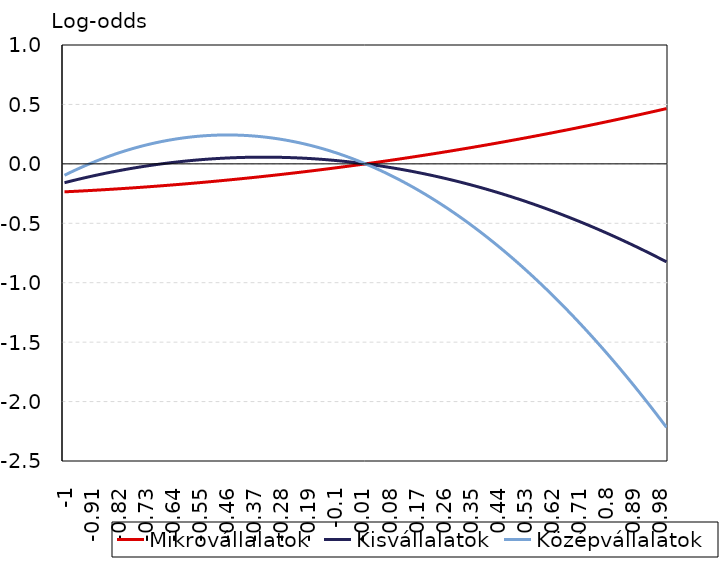
| Category | Mikrovállalatok | Kisvállalatok | Középvállalatok |
|---|---|---|---|
| -1.0 | -0.235 | -0.159 | -0.096 |
| -0.99 | -0.234 | -0.152 | -0.084 |
| -0.98 | -0.233 | -0.146 | -0.071 |
| -0.97 | -0.232 | -0.14 | -0.059 |
| -0.96 | -0.23 | -0.133 | -0.048 |
| -0.95 | -0.229 | -0.127 | -0.036 |
| -0.94 | -0.228 | -0.121 | -0.025 |
| -0.93 | -0.226 | -0.116 | -0.014 |
| -0.92 | -0.225 | -0.11 | -0.003 |
| -0.91 | -0.224 | -0.104 | 0.007 |
| -0.9 | -0.222 | -0.099 | 0.018 |
| -0.89 | -0.221 | -0.093 | 0.028 |
| -0.88 | -0.219 | -0.088 | 0.038 |
| -0.87 | -0.218 | -0.082 | 0.047 |
| -0.86 | -0.216 | -0.077 | 0.057 |
| -0.85 | -0.215 | -0.072 | 0.066 |
| -0.84 | -0.213 | -0.067 | 0.075 |
| -0.83 | -0.212 | -0.062 | 0.084 |
| -0.82 | -0.21 | -0.058 | 0.092 |
| -0.81 | -0.208 | -0.053 | 0.1 |
| -0.8 | -0.207 | -0.048 | 0.108 |
| -0.79 | -0.205 | -0.044 | 0.116 |
| -0.78 | -0.203 | -0.039 | 0.124 |
| -0.77 | -0.202 | -0.035 | 0.131 |
| -0.76 | -0.2 | -0.031 | 0.138 |
| -0.75 | -0.198 | -0.027 | 0.145 |
| -0.74 | -0.196 | -0.023 | 0.152 |
| -0.73 | -0.194 | -0.019 | 0.158 |
| -0.72 | -0.193 | -0.015 | 0.164 |
| -0.71 | -0.191 | -0.011 | 0.17 |
| -0.7 | -0.189 | -0.008 | 0.176 |
| -0.69 | -0.187 | -0.004 | 0.181 |
| -0.68 | -0.185 | -0.001 | 0.186 |
| -0.67 | -0.183 | 0.002 | 0.191 |
| -0.66 | -0.181 | 0.006 | 0.196 |
| -0.65 | -0.179 | 0.009 | 0.201 |
| -0.64 | -0.177 | 0.012 | 0.205 |
| -0.63 | -0.175 | 0.015 | 0.209 |
| -0.62 | -0.173 | 0.017 | 0.213 |
| -0.61 | -0.171 | 0.02 | 0.217 |
| -0.6 | -0.169 | 0.023 | 0.22 |
| -0.59 | -0.167 | 0.025 | 0.223 |
| -0.58 | -0.164 | 0.028 | 0.226 |
| -0.57 | -0.162 | 0.03 | 0.229 |
| -0.56 | -0.16 | 0.032 | 0.231 |
| -0.55 | -0.158 | 0.034 | 0.233 |
| -0.54 | -0.156 | 0.036 | 0.235 |
| -0.53 | -0.153 | 0.038 | 0.237 |
| -0.52 | -0.151 | 0.04 | 0.239 |
| -0.51 | -0.149 | 0.042 | 0.24 |
| -0.5 | -0.146 | 0.044 | 0.241 |
| -0.49 | -0.144 | 0.045 | 0.242 |
| -0.48 | -0.142 | 0.047 | 0.243 |
| -0.47 | -0.139 | 0.048 | 0.243 |
| -0.46 | -0.137 | 0.049 | 0.243 |
| -0.45 | -0.134 | 0.05 | 0.243 |
| -0.44 | -0.132 | 0.051 | 0.243 |
| -0.429999999999999 | -0.129 | 0.052 | 0.242 |
| -0.419999999999999 | -0.127 | 0.053 | 0.241 |
| -0.409999999999999 | -0.124 | 0.054 | 0.24 |
| -0.399999999999999 | -0.122 | 0.055 | 0.239 |
| -0.389999999999999 | -0.119 | 0.055 | 0.238 |
| -0.379999999999999 | -0.116 | 0.056 | 0.236 |
| -0.369999999999999 | -0.114 | 0.056 | 0.234 |
| -0.359999999999999 | -0.111 | 0.056 | 0.232 |
| -0.349999999999999 | -0.108 | 0.056 | 0.23 |
| -0.339999999999999 | -0.106 | 0.056 | 0.227 |
| -0.329999999999999 | -0.103 | 0.056 | 0.224 |
| -0.319999999999999 | -0.1 | 0.056 | 0.221 |
| -0.309999999999999 | -0.098 | 0.056 | 0.218 |
| -0.299999999999999 | -0.095 | 0.056 | 0.214 |
| -0.289999999999999 | -0.092 | 0.055 | 0.21 |
| -0.279999999999999 | -0.089 | 0.055 | 0.206 |
| -0.269999999999999 | -0.086 | 0.054 | 0.202 |
| -0.259999999999999 | -0.083 | 0.053 | 0.198 |
| -0.249999999999999 | -0.08 | 0.053 | 0.193 |
| -0.239999999999999 | -0.077 | 0.052 | 0.188 |
| -0.229999999999999 | -0.074 | 0.051 | 0.183 |
| -0.219999999999999 | -0.071 | 0.049 | 0.177 |
| -0.209999999999999 | -0.068 | 0.048 | 0.172 |
| -0.199999999999999 | -0.065 | 0.047 | 0.166 |
| -0.189999999999999 | -0.062 | 0.046 | 0.16 |
| -0.179999999999999 | -0.059 | 0.044 | 0.153 |
| -0.169999999999999 | -0.056 | 0.042 | 0.147 |
| -0.159999999999999 | -0.053 | 0.041 | 0.14 |
| -0.149999999999999 | -0.05 | 0.039 | 0.133 |
| -0.139999999999999 | -0.047 | 0.037 | 0.126 |
| -0.129999999999999 | -0.044 | 0.035 | 0.118 |
| -0.119999999999999 | -0.04 | 0.033 | 0.111 |
| -0.109999999999999 | -0.037 | 0.031 | 0.103 |
| -0.099999999999999 | -0.034 | 0.028 | 0.094 |
| -0.089999999999999 | -0.031 | 0.026 | 0.086 |
| -0.079999999999999 | -0.027 | 0.023 | 0.077 |
| -0.069999999999999 | -0.024 | 0.021 | 0.069 |
| -0.0599999999999991 | -0.021 | 0.018 | 0.059 |
| -0.049999999999999 | -0.017 | 0.015 | 0.05 |
| -0.039999999999999 | -0.014 | 0.013 | 0.041 |
| -0.029999999999999 | -0.01 | 0.01 | 0.031 |
| -0.019999999999999 | -0.007 | 0.006 | 0.021 |
| -0.00999999999999901 | -0.003 | 0.003 | 0.01 |
| 0.0 | 0 | 0 | 0 |
| 0.01 | 0.004 | -0.003 | -0.011 |
| 0.02 | 0.007 | -0.007 | -0.022 |
| 0.03 | 0.011 | -0.01 | -0.033 |
| 0.04 | 0.014 | -0.014 | -0.044 |
| 0.05 | 0.018 | -0.018 | -0.056 |
| 0.0600000000000001 | 0.021 | -0.022 | -0.068 |
| 0.0700000000000001 | 0.025 | -0.026 | -0.08 |
| 0.0800000000000001 | 0.029 | -0.03 | -0.092 |
| 0.0900000000000001 | 0.032 | -0.034 | -0.105 |
| 0.1 | 0.036 | -0.038 | -0.118 |
| 0.11 | 0.04 | -0.043 | -0.131 |
| 0.12 | 0.044 | -0.047 | -0.144 |
| 0.13 | 0.047 | -0.052 | -0.157 |
| 0.14 | 0.051 | -0.056 | -0.171 |
| 0.15 | 0.055 | -0.061 | -0.185 |
| 0.16 | 0.059 | -0.066 | -0.199 |
| 0.17 | 0.063 | -0.071 | -0.214 |
| 0.18 | 0.067 | -0.076 | -0.228 |
| 0.19 | 0.071 | -0.081 | -0.243 |
| 0.2 | 0.075 | -0.086 | -0.258 |
| 0.21 | 0.079 | -0.092 | -0.274 |
| 0.22 | 0.083 | -0.097 | -0.289 |
| 0.23 | 0.087 | -0.103 | -0.305 |
| 0.24 | 0.091 | -0.108 | -0.321 |
| 0.25 | 0.095 | -0.114 | -0.337 |
| 0.26 | 0.099 | -0.12 | -0.354 |
| 0.27 | 0.103 | -0.126 | -0.371 |
| 0.28 | 0.107 | -0.132 | -0.388 |
| 0.29 | 0.111 | -0.138 | -0.405 |
| 0.3 | 0.115 | -0.144 | -0.422 |
| 0.31 | 0.12 | -0.15 | -0.44 |
| 0.32 | 0.124 | -0.157 | -0.458 |
| 0.33 | 0.128 | -0.163 | -0.476 |
| 0.34 | 0.132 | -0.17 | -0.494 |
| 0.35 | 0.137 | -0.177 | -0.513 |
| 0.36 | 0.141 | -0.184 | -0.532 |
| 0.37 | 0.145 | -0.191 | -0.551 |
| 0.38 | 0.15 | -0.198 | -0.57 |
| 0.39 | 0.154 | -0.205 | -0.589 |
| 0.4 | 0.158 | -0.212 | -0.609 |
| 0.41 | 0.163 | -0.219 | -0.629 |
| 0.42 | 0.167 | -0.227 | -0.649 |
| 0.43 | 0.172 | -0.234 | -0.67 |
| 0.44 | 0.176 | -0.242 | -0.691 |
| 0.45 | 0.181 | -0.249 | -0.711 |
| 0.46 | 0.185 | -0.257 | -0.733 |
| 0.47 | 0.19 | -0.265 | -0.754 |
| 0.48 | 0.195 | -0.273 | -0.775 |
| 0.49 | 0.199 | -0.281 | -0.797 |
| 0.5 | 0.204 | -0.289 | -0.819 |
| 0.51 | 0.208 | -0.298 | -0.842 |
| 0.52 | 0.213 | -0.306 | -0.864 |
| 0.53 | 0.218 | -0.315 | -0.887 |
| 0.54 | 0.223 | -0.323 | -0.91 |
| 0.55 | 0.227 | -0.332 | -0.933 |
| 0.56 | 0.232 | -0.341 | -0.957 |
| 0.57 | 0.237 | -0.35 | -0.98 |
| 0.58 | 0.242 | -0.359 | -1.004 |
| 0.59 | 0.247 | -0.368 | -1.028 |
| 0.6 | 0.251 | -0.377 | -1.053 |
| 0.61 | 0.256 | -0.386 | -1.077 |
| 0.62 | 0.261 | -0.395 | -1.102 |
| 0.63 | 0.266 | -0.405 | -1.127 |
| 0.64 | 0.271 | -0.414 | -1.152 |
| 0.65 | 0.276 | -0.424 | -1.178 |
| 0.66 | 0.281 | -0.434 | -1.204 |
| 0.67 | 0.286 | -0.444 | -1.23 |
| 0.68 | 0.291 | -0.454 | -1.256 |
| 0.69 | 0.296 | -0.464 | -1.282 |
| 0.7 | 0.301 | -0.474 | -1.309 |
| 0.71 | 0.306 | -0.484 | -1.336 |
| 0.72 | 0.312 | -0.495 | -1.363 |
| 0.73 | 0.317 | -0.505 | -1.39 |
| 0.74 | 0.322 | -0.516 | -1.418 |
| 0.75 | 0.327 | -0.526 | -1.446 |
| 0.76 | 0.332 | -0.537 | -1.474 |
| 0.77 | 0.338 | -0.548 | -1.502 |
| 0.78 | 0.343 | -0.559 | -1.531 |
| 0.79 | 0.348 | -0.57 | -1.56 |
| 0.8 | 0.354 | -0.581 | -1.589 |
| 0.81 | 0.359 | -0.592 | -1.618 |
| 0.82 | 0.364 | -0.604 | -1.647 |
| 0.83 | 0.37 | -0.615 | -1.677 |
| 0.84 | 0.375 | -0.627 | -1.707 |
| 0.85 | 0.381 | -0.638 | -1.737 |
| 0.86 | 0.386 | -0.65 | -1.767 |
| 0.87 | 0.391 | -0.662 | -1.798 |
| 0.88 | 0.397 | -0.674 | -1.829 |
| 0.89 | 0.403 | -0.686 | -1.86 |
| 0.9 | 0.408 | -0.698 | -1.891 |
| 0.91 | 0.414 | -0.71 | -1.923 |
| 0.92 | 0.419 | -0.722 | -1.954 |
| 0.93 | 0.425 | -0.735 | -1.986 |
| 0.94 | 0.431 | -0.747 | -2.019 |
| 0.95 | 0.436 | -0.76 | -2.051 |
| 0.96 | 0.442 | -0.773 | -2.084 |
| 0.97 | 0.448 | -0.786 | -2.117 |
| 0.98 | 0.453 | -0.798 | -2.15 |
| 0.99 | 0.459 | -0.811 | -2.183 |
| 1.0 | 0.465 | -0.825 | -2.217 |